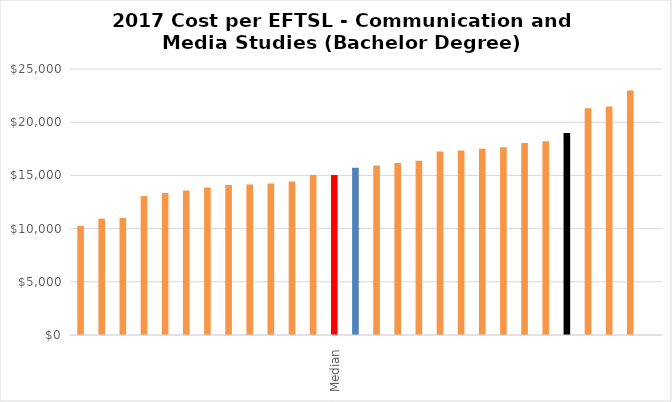
| Category | Series 0 |
|---|---|
|  | 10257.213 |
|  | 10935.931 |
|  | 11001.738 |
|  | 13052.472 |
|  | 13341.784 |
|  | 13586.607 |
|  | 13859.126 |
|  | 14086.735 |
|  | 14151.813 |
|  | 14227.403 |
|  | 14418.789 |
|  | 15040.787 |
| Median | 15044.728 |
| Mean | 15729 |
|  | 15922.536 |
|  | 16154.34 |
|  | 16379.272 |
|  | 17242.775 |
|  | 17341.74 |
|  | 17493.172 |
|  | 17655.596 |
|  | 18049.615 |
|  | 18219.125 |
| 2017 Base Funding per EFTSL | 18990 |